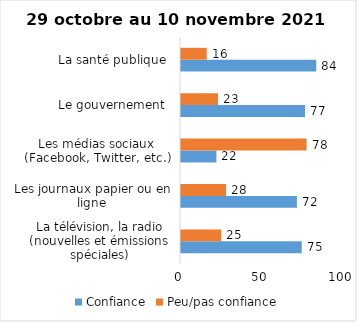
| Category | Confiance | Peu/pas confiance |
|---|---|---|
| La télévision, la radio (nouvelles et émissions spéciales) | 75 | 25 |
| Les journaux papier ou en ligne | 72 | 28 |
| Les médias sociaux (Facebook, Twitter, etc.) | 22 | 78 |
| Le gouvernement  | 77 | 23 |
| La santé publique  | 84 | 16 |